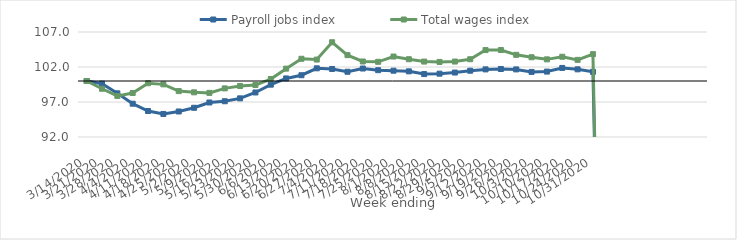
| Category | Payroll jobs index | Total wages index |
|---|---|---|
| 14/03/2020 | 100 | 100 |
| 21/03/2020 | 99.617 | 98.895 |
| 28/03/2020 | 98.236 | 97.865 |
| 04/04/2020 | 96.759 | 98.285 |
| 11/04/2020 | 95.71 | 99.683 |
| 18/04/2020 | 95.295 | 99.518 |
| 25/04/2020 | 95.646 | 98.558 |
| 02/05/2020 | 96.175 | 98.381 |
| 09/05/2020 | 96.929 | 98.303 |
| 16/05/2020 | 97.107 | 98.945 |
| 23/05/2020 | 97.521 | 99.283 |
| 30/05/2020 | 98.361 | 99.424 |
| 06/06/2020 | 99.477 | 100.278 |
| 13/06/2020 | 100.366 | 101.765 |
| 20/06/2020 | 100.823 | 103.176 |
| 27/06/2020 | 101.812 | 103.061 |
| 04/07/2020 | 101.718 | 105.535 |
| 11/07/2020 | 101.32 | 103.695 |
| 18/07/2020 | 101.783 | 102.789 |
| 25/07/2020 | 101.546 | 102.74 |
| 01/08/2020 | 101.471 | 103.495 |
| 08/08/2020 | 101.378 | 103.111 |
| 15/08/2020 | 100.988 | 102.777 |
| 22/08/2020 | 101.047 | 102.723 |
| 29/08/2020 | 101.206 | 102.778 |
| 05/09/2020 | 101.469 | 103.109 |
| 12/09/2020 | 101.659 | 104.418 |
| 19/09/2020 | 101.713 | 104.428 |
| 26/09/2020 | 101.657 | 103.735 |
| 03/10/2020 | 101.299 | 103.393 |
| 10/10/2020 | 101.346 | 103.092 |
| 17/10/2020 | 101.867 | 103.465 |
| 24/10/2020 | 101.667 | 103.018 |
| 31/10/2020 | 101.312 | 103.837 |